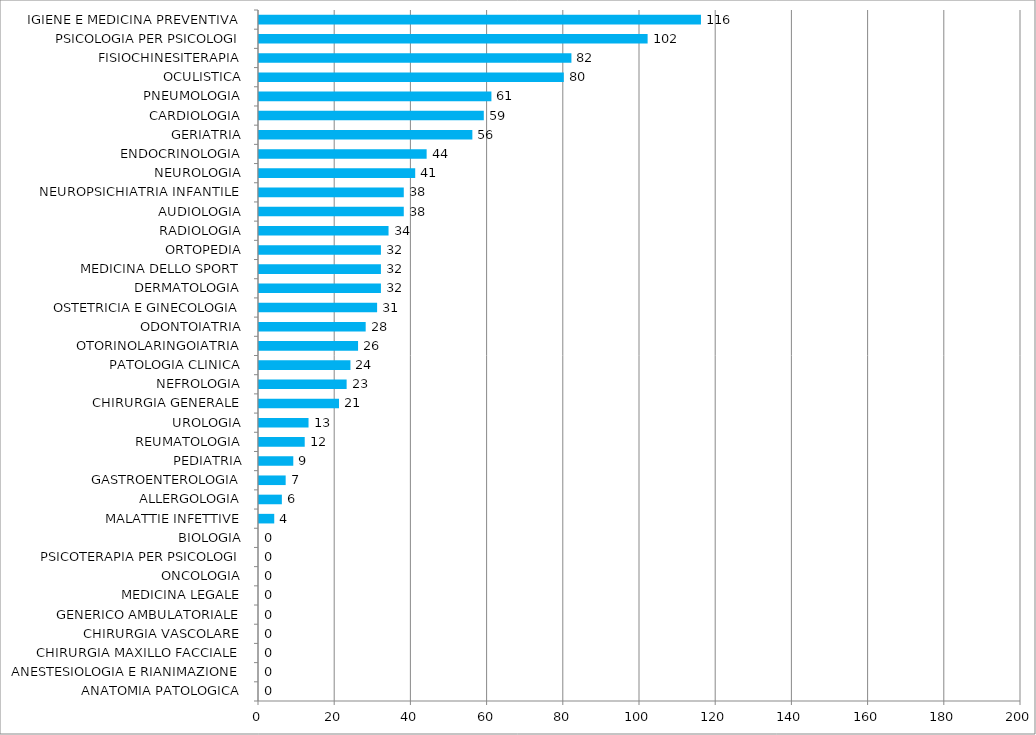
| Category | Series 0 |
|---|---|
| ANATOMIA PATOLOGICA | 0 |
| ANESTESIOLOGIA E RIANIMAZIONE | 0 |
| CHIRURGIA MAXILLO FACCIALE | 0 |
| CHIRURGIA VASCOLARE | 0 |
| GENERICO AMBULATORIALE | 0 |
| MEDICINA LEGALE | 0 |
| ONCOLOGIA | 0 |
| PSICOTERAPIA PER PSICOLOGI | 0 |
| BIOLOGIA | 0 |
| MALATTIE INFETTIVE | 4 |
| ALLERGOLOGIA | 6 |
| GASTROENTEROLOGIA | 7 |
| PEDIATRIA | 9 |
| REUMATOLOGIA | 12 |
| UROLOGIA | 13 |
| CHIRURGIA GENERALE | 21 |
| NEFROLOGIA | 23 |
| PATOLOGIA CLINICA | 24 |
| OTORINOLARINGOIATRIA | 26 |
| ODONTOIATRIA | 28 |
| OSTETRICIA E GINECOLOGIA | 31 |
| DERMATOLOGIA | 32 |
| MEDICINA DELLO SPORT | 32 |
| ORTOPEDIA | 32 |
| RADIOLOGIA | 34 |
| AUDIOLOGIA | 38 |
| NEUROPSICHIATRIA INFANTILE | 38 |
| NEUROLOGIA | 41 |
| ENDOCRINOLOGIA | 44 |
| GERIATRIA | 56 |
| CARDIOLOGIA | 59 |
| PNEUMOLOGIA | 61 |
| OCULISTICA | 80 |
| FISIOCHINESITERAPIA | 82 |
| PSICOLOGIA PER PSICOLOGI | 102 |
| IGIENE E MEDICINA PREVENTIVA | 116 |